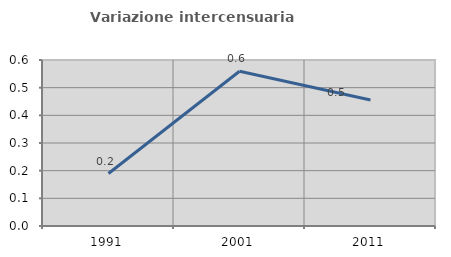
| Category | Variazione intercensuaria annua |
|---|---|
| 1991.0 | 0.19 |
| 2001.0 | 0.559 |
| 2011.0 | 0.455 |